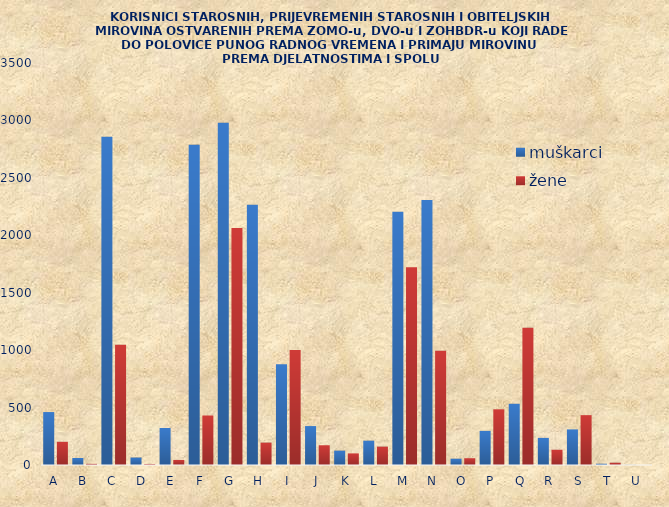
| Category | muškarci | žene |
|---|---|---|
| A | 461 | 202 |
| B | 61 | 10 |
| C | 2857 | 1046 |
| D | 65 | 8 |
| E | 322 | 44 |
| F | 2789 | 431 |
| G | 2980 | 2064 |
| H | 2266 | 195 |
| I | 877 | 1001 |
| J | 339 | 172 |
| K | 125 | 101 |
| L | 212 | 160 |
| M | 2206 | 1721 |
| N | 2307 | 994 |
| O | 55 | 59 |
| P | 297 | 485 |
| Q | 533 | 1194 |
| R | 236 | 133 |
| S | 310 | 434 |
| T | 11 | 20 |
| U | 1 | 0 |